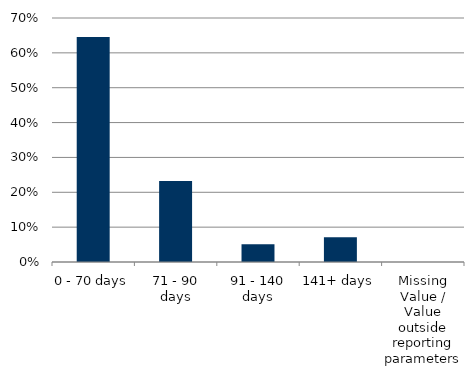
| Category | Total |
|---|---|
| 0 - 70 days | 0.646 |
| 71 - 90 days | 0.232 |
| 91 - 140 days | 0.051 |
| 141+ days | 0.071 |
| Missing Value / Value outside reporting parameters | 0 |